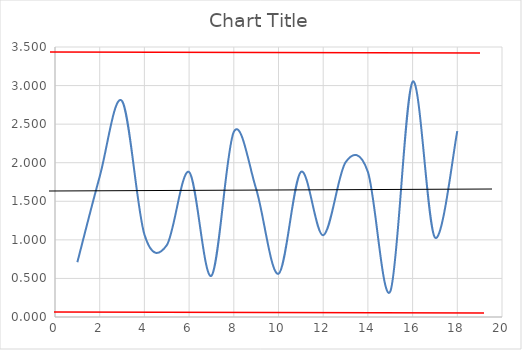
| Category | Series 0 |
|---|---|
| 1.0 | 0.71 |
| 2.0 | 1.82 |
| 3.0 | 2.8 |
| 4.0 | 1.07 |
| 5.0 | 0.93 |
| 6.0 | 1.88 |
| 7.0 | 0.535 |
| 8.0 | 2.4 |
| 9.0 | 1.66 |
| 10.0 | 0.56 |
| 11.0 | 1.88 |
| 12.0 | 1.06 |
| 13.0 | 2.005 |
| 14.0 | 1.88 |
| 15.0 | 0.33 |
| 16.0 | 3.05 |
| 17.0 | 1.03 |
| 18.0 | 2.41 |